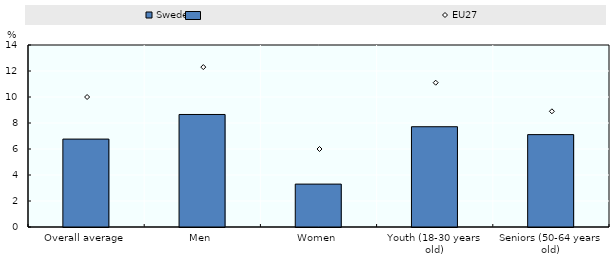
| Category | Sweden |
|---|---|
| Overall average | 6.763 |
| Men | 8.656 |
| Women | 3.3 |
| Youth (18-30 years old) | 7.714 |
| Seniors (50-64 years old) | 7.106 |